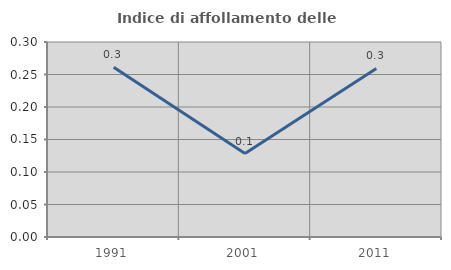
| Category | Indice di affollamento delle abitazioni  |
|---|---|
| 1991.0 | 0.261 |
| 2001.0 | 0.128 |
| 2011.0 | 0.259 |